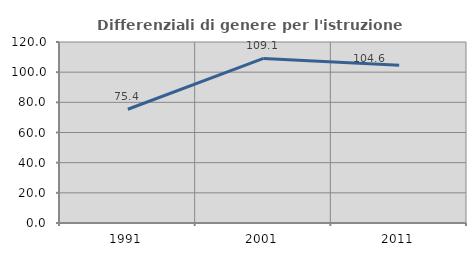
| Category | Differenziali di genere per l'istruzione superiore |
|---|---|
| 1991.0 | 75.41 |
| 2001.0 | 109.112 |
| 2011.0 | 104.576 |